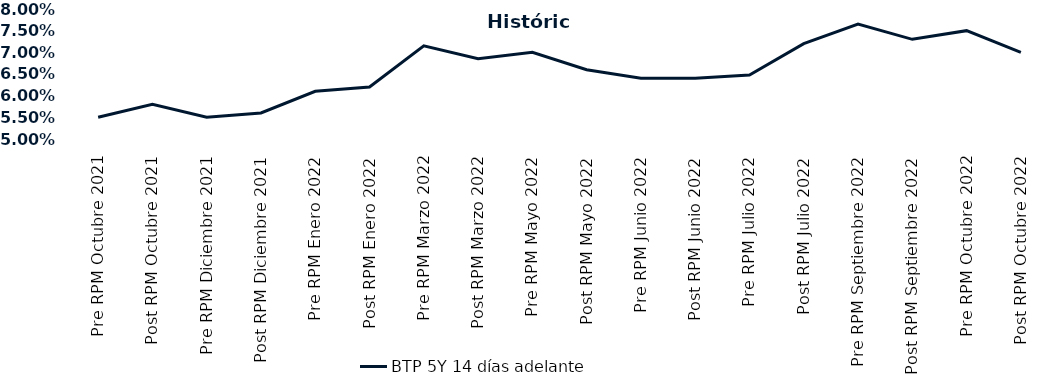
| Category | BTP 5Y 14 días adelante |
|---|---|
| Pre RPM Octubre 2021 | 0.055 |
| Post RPM Octubre 2021 | 0.058 |
| Pre RPM Diciembre 2021 | 0.055 |
| Post RPM Diciembre 2021 | 0.056 |
| Pre RPM Enero 2022 | 0.061 |
| Post RPM Enero 2022 | 0.062 |
| Pre RPM Marzo 2022 | 0.072 |
| Post RPM Marzo 2022 | 0.068 |
| Pre RPM Mayo 2022 | 0.07 |
| Post RPM Mayo 2022 | 0.066 |
| Pre RPM Junio 2022 | 0.064 |
| Post RPM Junio 2022 | 0.064 |
| Pre RPM Julio 2022 | 0.065 |
| Post RPM Julio 2022 | 0.072 |
| Pre RPM Septiembre 2022 | 0.076 |
| Post RPM Septiembre 2022 | 0.073 |
| Pre RPM Octubre 2022 | 0.075 |
| Post RPM Octubre 2022 | 0.07 |